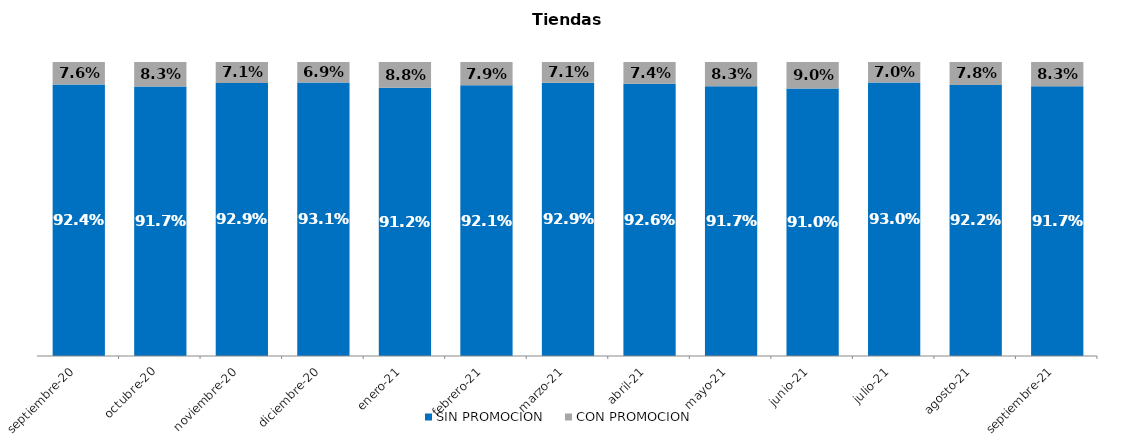
| Category | SIN PROMOCION   | CON PROMOCION   |
|---|---|---|
| 2020-09-01 | 0.924 | 0.076 |
| 2020-10-01 | 0.917 | 0.083 |
| 2020-11-01 | 0.929 | 0.071 |
| 2020-12-01 | 0.931 | 0.069 |
| 2021-01-01 | 0.912 | 0.088 |
| 2021-02-01 | 0.921 | 0.079 |
| 2021-03-01 | 0.929 | 0.071 |
| 2021-04-01 | 0.926 | 0.074 |
| 2021-05-01 | 0.917 | 0.083 |
| 2021-06-01 | 0.91 | 0.09 |
| 2021-07-01 | 0.93 | 0.07 |
| 2021-08-01 | 0.922 | 0.078 |
| 2021-09-01 | 0.917 | 0.083 |